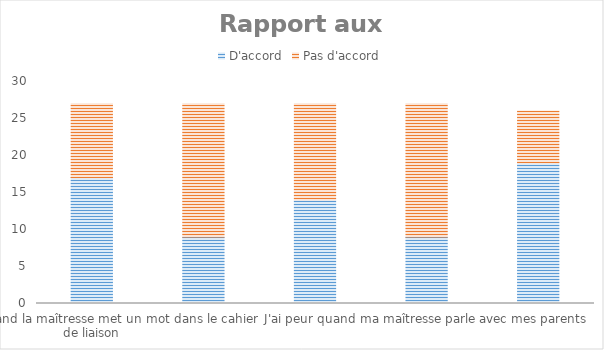
| Category | D'accord | Pas d'accord |
|---|---|---|
| J'ai peur quand la maîtresse met un mot dans le cahier de liaison | 17 | 10 |
| J'ai peur de montrer mon travail à mes parents | 9 | 18 |
| J'ai peur de me tromper quand je fais des exercices | 14 | 13 |
| J'ai peur quand ma maîtresse parle avec mes parents | 9 | 18 |
| J'ai peur d'avoir de mauvaises notes | 19 | 7 |